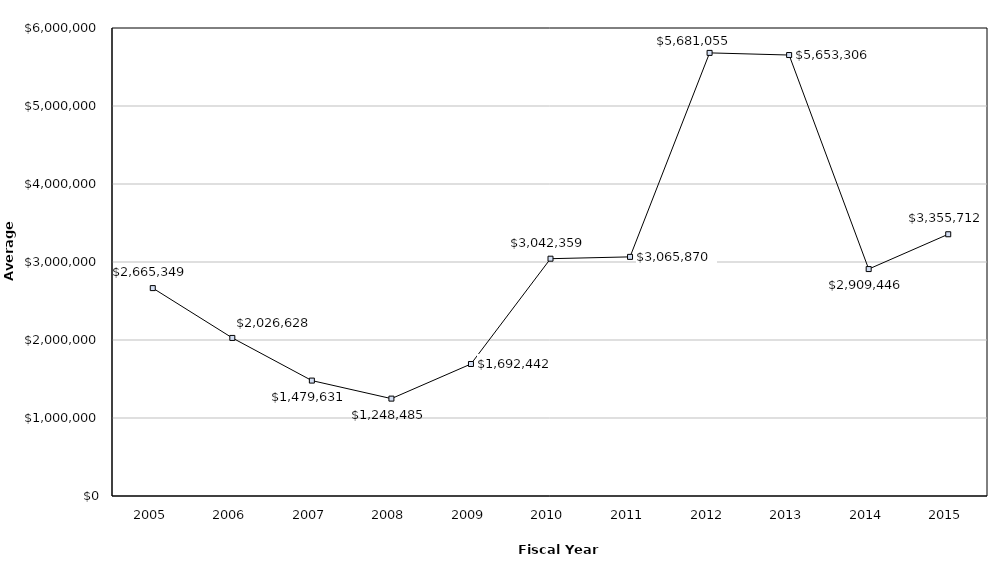
| Category | Mean |
|---|---|
| 2005.0 | 2665349 |
| 2006.0 | 2026628 |
| 2007.0 | 1479631 |
| 2008.0 | 1248485 |
| 2009.0 | 1692442 |
| 2010.0 | 3042359 |
| 2011.0 | 3065870 |
| 2012.0 | 5681055 |
| 2013.0 | 5653306 |
| 2014.0 | 2909446 |
| 2015.0 | 3355712 |